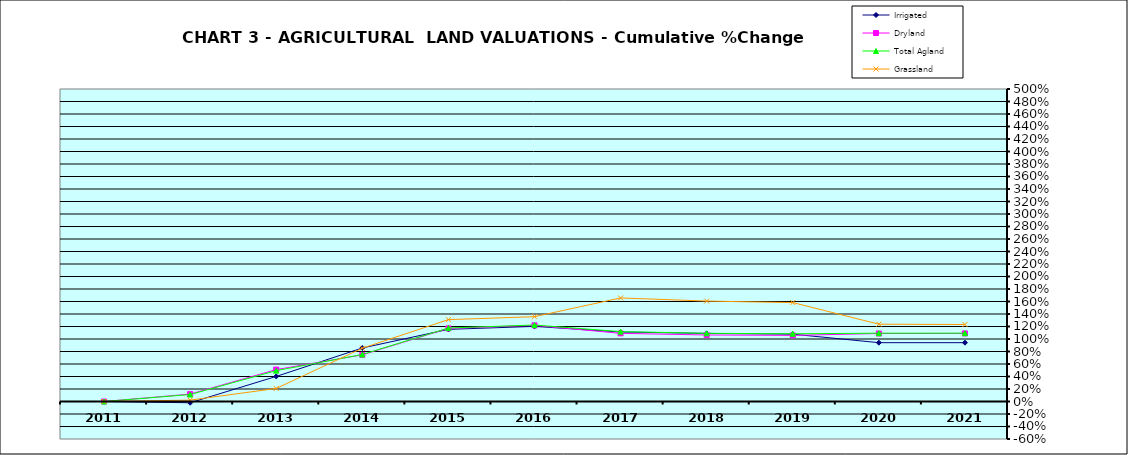
| Category | Irrigated | Dryland | Total Agland | Grassland |
|---|---|---|---|---|
| 2011.0 | 0 | 0 | 0 | 0 |
| 2012.0 | -0.02 | 0.118 | 0.111 | 0.022 |
| 2013.0 | 0.401 | 0.511 | 0.494 | 0.209 |
| 2014.0 | 0.856 | 0.746 | 0.752 | 0.853 |
| 2015.0 | 1.154 | 1.17 | 1.176 | 1.31 |
| 2016.0 | 1.202 | 1.218 | 1.224 | 1.357 |
| 2017.0 | 1.112 | 1.09 | 1.118 | 1.657 |
| 2018.0 | 1.09 | 1.064 | 1.091 | 1.607 |
| 2019.0 | 1.077 | 1.058 | 1.083 | 1.583 |
| 2020.0 | 0.941 | 1.088 | 1.093 | 1.237 |
| 2021.0 | 0.941 | 1.089 | 1.093 | 1.232 |